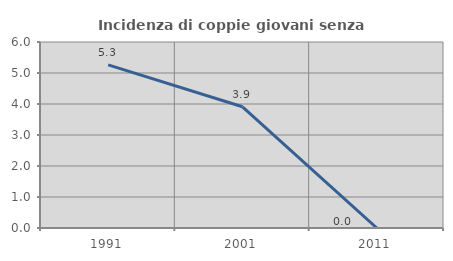
| Category | Incidenza di coppie giovani senza figli |
|---|---|
| 1991.0 | 5.263 |
| 2001.0 | 3.911 |
| 2011.0 | 0 |